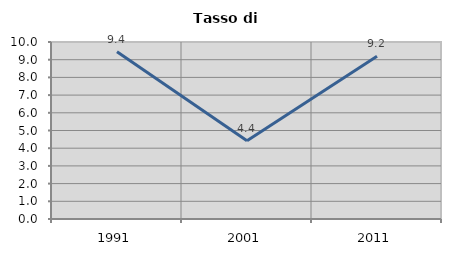
| Category | Tasso di disoccupazione   |
|---|---|
| 1991.0 | 9.449 |
| 2001.0 | 4.425 |
| 2011.0 | 9.189 |